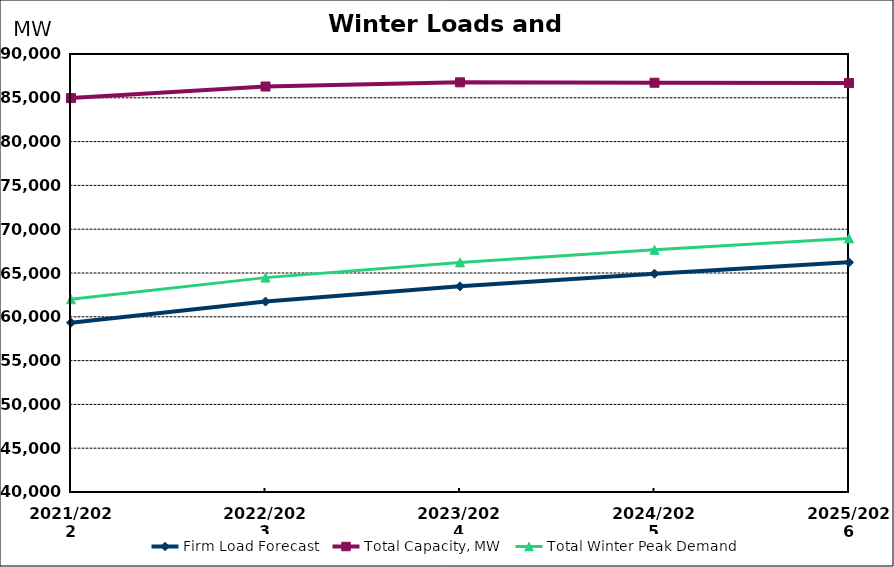
| Category | Firm Load Forecast | Total Capacity, MW | Total Winter Peak Demand |
|---|---|---|---|
| 2021/2022 | 59321.991 | 84965.979 | 62000.532 |
| 2022/2023 | 61739.983 | 86287.489 | 64472.094 |
| 2023/2024 | 63479.552 | 86764.491 | 66211.662 |
| 2024/2025 | 64915.874 | 86719.491 | 67647.984 |
| 2025/2026 | 66220.317 | 86679.491 | 68952.427 |